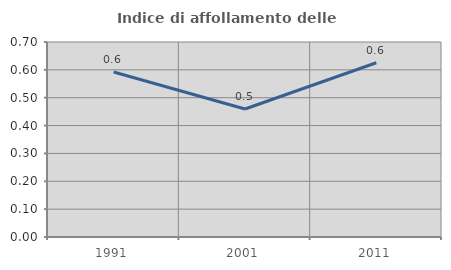
| Category | Indice di affollamento delle abitazioni  |
|---|---|
| 1991.0 | 0.592 |
| 2001.0 | 0.459 |
| 2011.0 | 0.625 |